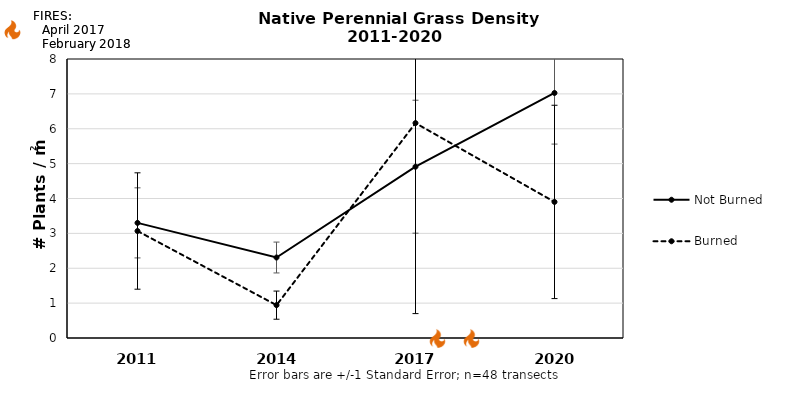
| Category | Not Burned | Burned |
|---|---|---|
| 2011.0 | 3.301 | 3.068 |
| 2014.0 | 2.308 | 0.942 |
| 2017.0 | 4.912 | 6.162 |
| 2020.0 | 7.026 | 3.902 |